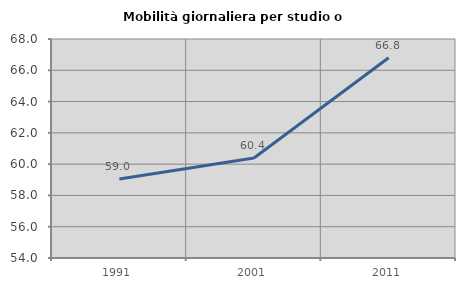
| Category | Mobilità giornaliera per studio o lavoro |
|---|---|
| 1991.0 | 59.044 |
| 2001.0 | 60.395 |
| 2011.0 | 66.801 |